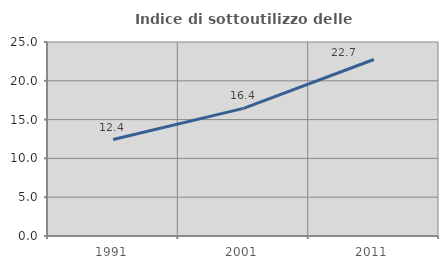
| Category | Indice di sottoutilizzo delle abitazioni  |
|---|---|
| 1991.0 | 12.431 |
| 2001.0 | 16.45 |
| 2011.0 | 22.742 |